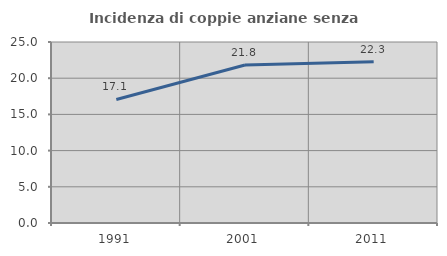
| Category | Incidenza di coppie anziane senza figli  |
|---|---|
| 1991.0 | 17.059 |
| 2001.0 | 21.824 |
| 2011.0 | 22.264 |